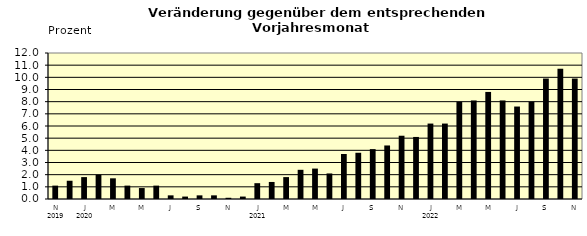
| Category | Series 0 |
|---|---|
| 0 | 1.1 |
| 1 | 1.5 |
| 2 | 1.8 |
| 3 | 2 |
| 4 | 1.7 |
| 5 | 1.1 |
| 6 | 0.9 |
| 7 | 1.1 |
| 8 | 0.3 |
| 9 | 0.2 |
| 10 | 0.3 |
| 11 | 0.3 |
| 12 | 0.1 |
| 13 | 0.2 |
| 14 | 1.3 |
| 15 | 1.4 |
| 16 | 1.8 |
| 17 | 2.4 |
| 18 | 2.5 |
| 19 | 2.1 |
| 20 | 3.7 |
| 21 | 3.8 |
| 22 | 4.1 |
| 23 | 4.4 |
| 24 | 5.2 |
| 25 | 5.1 |
| 26 | 6.2 |
| 27 | 6.2 |
| 28 | 8 |
| 29 | 8.1 |
| 30 | 8.8 |
| 31 | 8.1 |
| 32 | 7.6 |
| 33 | 8 |
| 34 | 9.9 |
| 35 | 10.7 |
| 36 | 9.9 |